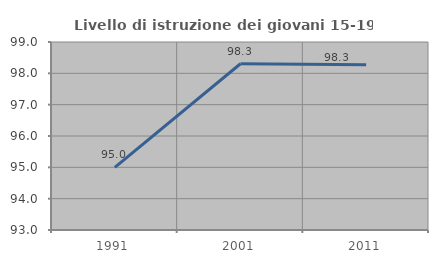
| Category | Livello di istruzione dei giovani 15-19 anni |
|---|---|
| 1991.0 | 95 |
| 2001.0 | 98.305 |
| 2011.0 | 98.276 |